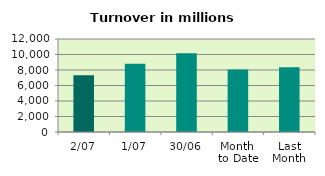
| Category | Series 0 |
|---|---|
| 2/07 | 7321.625 |
| 1/07 | 8822.078 |
| 30/06 | 10167.398 |
| Month 
to Date | 8071.851 |
| Last
Month | 8344.334 |